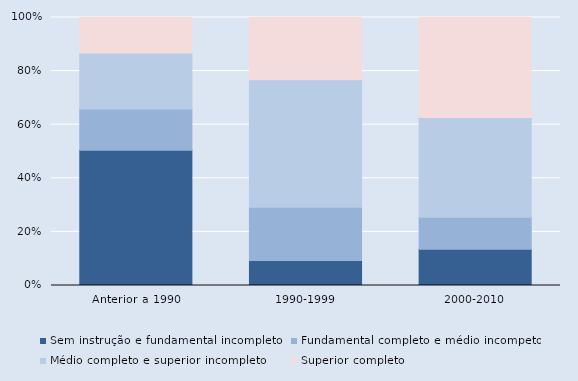
| Category | Sem instrução e fundamental incompleto | Fundamental completo e médio incompeto | Médio completo e superior incompleto | Superior completo |
|---|---|---|---|---|
| Anterior a 1990 | 50.49 | 15.4 | 20.99 | 13.23 |
| 1990-1999 | 9.36 | 19.82 | 47.63 | 23.19 |
| 2000-2010 | 13.54 | 11.91 | 37.21 | 37.24 |